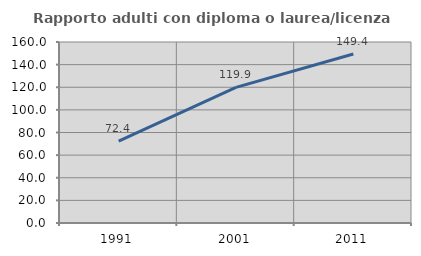
| Category | Rapporto adulti con diploma o laurea/licenza media  |
|---|---|
| 1991.0 | 72.426 |
| 2001.0 | 119.88 |
| 2011.0 | 149.406 |